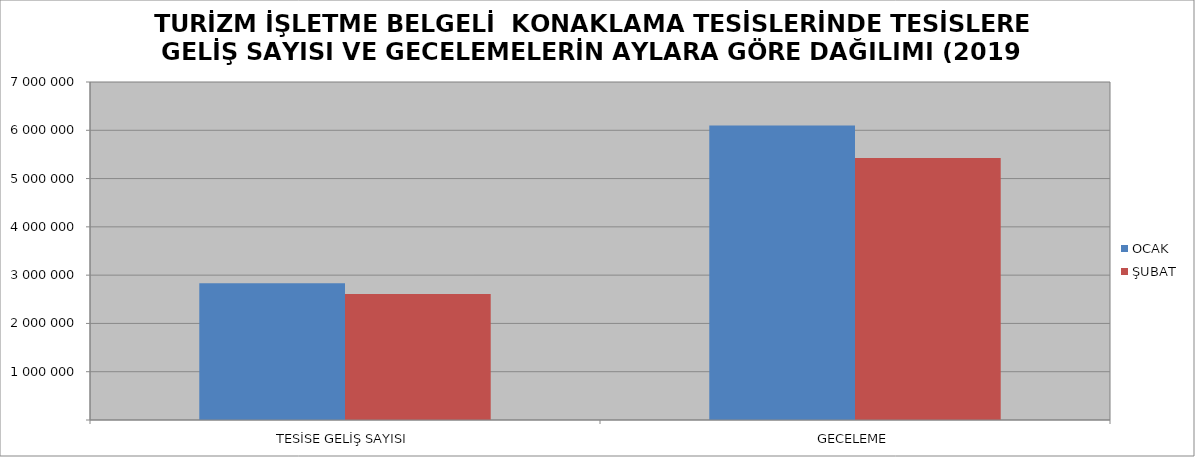
| Category | OCAK | ŞUBAT |
|---|---|---|
| TESİSE GELİŞ SAYISI | 2833509 | 2607189 |
| GECELEME | 6098050 | 5425989 |